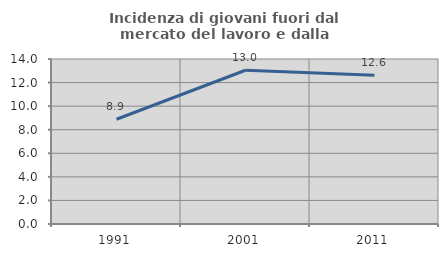
| Category | Incidenza di giovani fuori dal mercato del lavoro e dalla formazione  |
|---|---|
| 1991.0 | 8.887 |
| 2001.0 | 13.047 |
| 2011.0 | 12.613 |